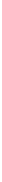
| Category | MQ |
|---|---|
| 34.47 | 3 |
| 40.01 | 1 |
| 37.48 | 3 |
| 40.11 | 0 |
| 30.68 | 2 |